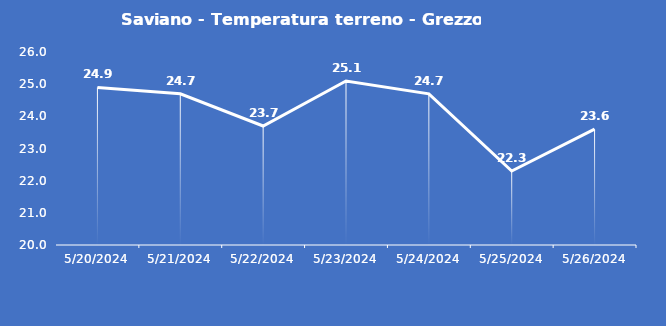
| Category | Saviano - Temperatura terreno - Grezzo (°C) |
|---|---|
| 5/20/24 | 24.9 |
| 5/21/24 | 24.7 |
| 5/22/24 | 23.7 |
| 5/23/24 | 25.1 |
| 5/24/24 | 24.7 |
| 5/25/24 | 22.3 |
| 5/26/24 | 23.6 |